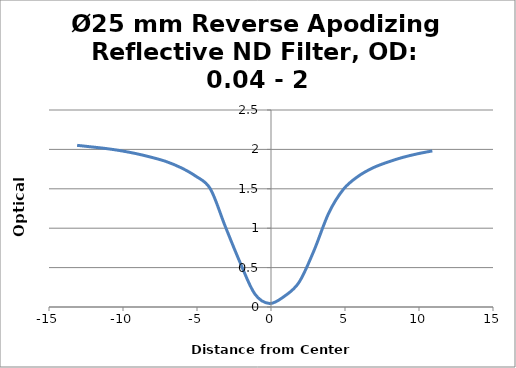
| Category | Optical Density |
|---|---|
| -13.1 | 2.052 |
| -12.1 | 2.031 |
| -11.1 | 2.01 |
| -10.1 | 1.982 |
| -9.1 | 1.946 |
| -8.1 | 1.901 |
| -7.1 | 1.847 |
| -6.1 | 1.769 |
| -5.1 | 1.662 |
| -4.1 | 1.5 |
| -3.1 | 1.027 |
| -2.1 | 0.57 |
| -1.1 | 0.167 |
| -0.1 | 0.045 |
| 0.9 | 0.135 |
| 1.9 | 0.315 |
| 2.9 | 0.714 |
| 3.9 | 1.191 |
| 4.9 | 1.496 |
| 5.9 | 1.66 |
| 6.9 | 1.767 |
| 7.9 | 1.84 |
| 8.9 | 1.899 |
| 9.9 | 1.944 |
| 10.9 | 1.981 |